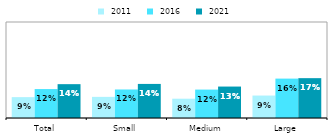
| Category |  2011 |  2016 |  2021 |
|---|---|---|---|
| Total | 0.087 | 0.121 | 0.141 |
| Small | 0.088 | 0.119 | 0.142 |
| Medium | 0.08 | 0.118 | 0.131 |
| Large | 0.094 | 0.164 | 0.166 |